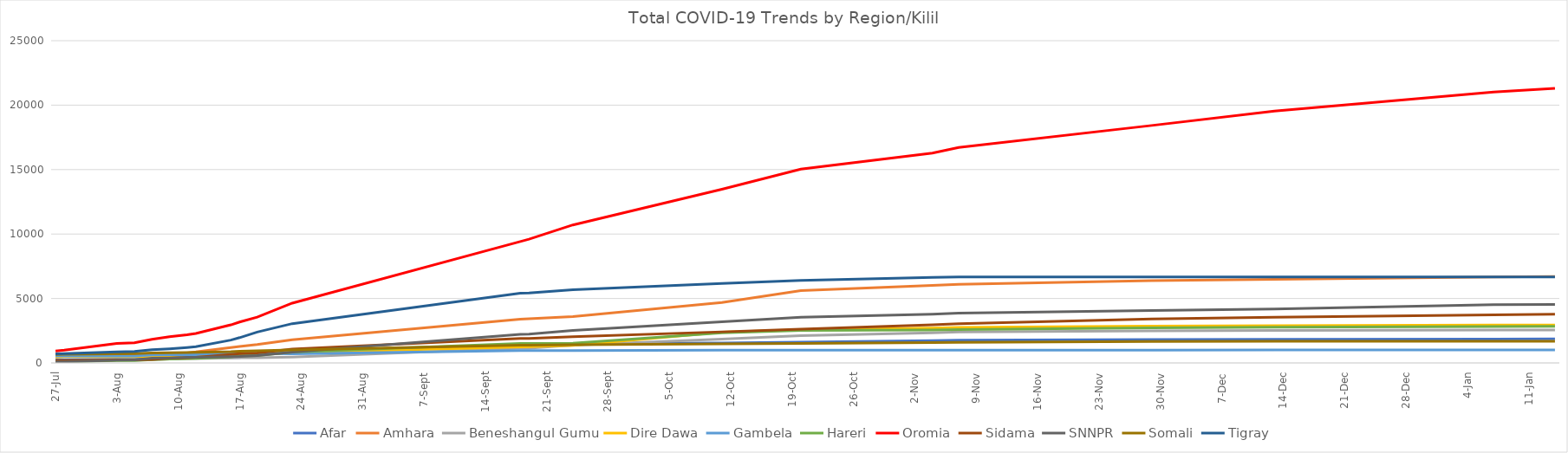
| Category | Afar | Amhara | Beneshangul Gumu | Dire Dawa | Gambela | Hareri | Oromia | Sidama | SNNPR | Somali | Tigray |
|---|---|---|---|---|---|---|---|---|---|---|---|
| 2020-07-27 | 256 | 484 | 149 | 459 | 531 | 94 | 923 | 182 | 83 | 651 | 713 |
| 2020-07-28 | 260 | 499 | 149 | 484 | 536 | 94 | 985 | 188 | 90 | 673 | 727 |
| 2020-08-03 | 292 | 607 | 219 | 484 | 536 | 181 | 1506 | 238 | 210 | 711 | 860 |
| 2020-08-05 | 293 | 627 | 221 | 484 | 536 | 181 | 1561 | 238 | 234 | 730 | 897 |
| 2020-08-07 | 299 | 641 | 245 | 528 | 614 | 256 | 1837 | 267 | 370 | 769 | 1019 |
| 2020-08-09 | 313 | 691 | 299 | 548 | 637 | 309 | 2026 | 366 | 393 | 795 | 1089 |
| 2020-08-11 | 391 | 780 | 333 | 588 | 637 | 342 | 2180 | 406 | 429 | 814 | 1189 |
| 2020-08-12 | 391 | 850 | 336 | 624 | 637 | 357 | 2288 | 430 | 432 | 821 | 1254 |
| 2020-08-16 | 415 | 1195 | 388 | 680 | 739 | 472 | 2953 | 658 | 488 | 866 | 1770 |
| 2020-08-17 | 415 | 1278 | 395 | 711 | 739 | 555 | 3177 | 721 | 503 | 901 | 1962 |
| 2020-08-19 | 650 | 1427 | 408 | 737 | 739 | 574 | 3557 | 774 | 567 | 933 | 2394 |
| 2020-08-23 | 803 | 1803 | 462 | 797 | 712 | 839 | 4640 | 1068 | 833 | 1007 | 3048 |
| 2020-09-18 | 1408 | 3388 | 1138 | 1246 | 954 | 1505 | 9415 | 1897 | 2211 | 1375 | 5403 |
| 2020-09-19 | 1447 | 3427 | 1138 | 1260 | 954 | 1514 | 9602 | 1897 | 2242 | 1376 | 5433 |
| 2020-09-24 | 1488 | 3597 | 1375 | 1366 | 966 | 1530 | 10707 | 2025 | 2520 | 1418 | 5683 |
| 2020-10-11 | 1547 | 4688 | 1846 | 2393 | 991 | 2343 | 13480 | 2411 | 3199 | 1480 | 6165 |
| 2020-10-20 | 1618 | 5604 | 2121 | 2577 | 993 | 2520 | 15033 | 2624 | 3543 | 1513 | 6402 |
| 2020-11-04 | 1727 | 6010 | 2343 | 2704 | 997 | 2556 | 16283 | 2954 | 3776 | 1576 | 6639 |
| 2020-11-07 | 1757 | 6094 | 2397 | 2749 | 997 | 2588 | 16716 | 3039 | 3863 | 1590 | 6662 |
| 2020-11-29 | 1810 | 6380 | 2489 | 2853 | 997 | 2725 | 18423 | 3407 | 4072 | 1670 | 6662 |
| 2020-12-13 | 1830 | 6486 | 2525 | 2889 | 1001 | 2770 | 19541 | 3545 | 4181 | 1672 | 6662 |
| 2021-01-07 | 1845 | 6674 | 2546 | 2942 | 1009 | 2824 | 21019 | 3732 | 4517 | 1676 | 6662 |
| 2021-01-14 | 1858 | 6709 | 2549 | 2945 | 1009 | 2837 | 21302 | 3774 | 4536 | 1678 | 6662 |